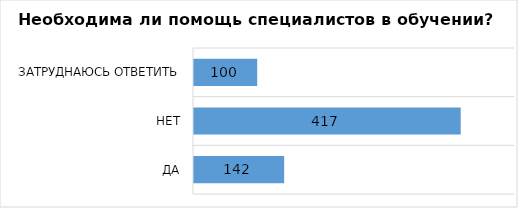
| Category | Series 0 |
|---|---|
| Да | 142 |
| Нет | 417 |
| Затруднаюсь ответить | 100 |